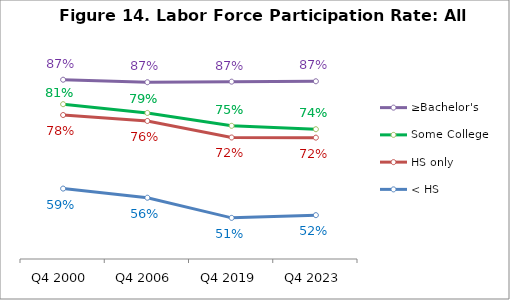
| Category | ≥Bachelor's | Some College | HS only | < HS |
|---|---|---|---|---|
| Q4 2000 | 0.874 | 0.809 | 0.781 | 0.586 |
| Q4 2006 | 0.867 | 0.786 | 0.765 | 0.562 |
| Q4 2019 | 0.869 | 0.752 | 0.721 | 0.509 |
| Q4 2023 | 0.87 | 0.743 | 0.721 | 0.516 |